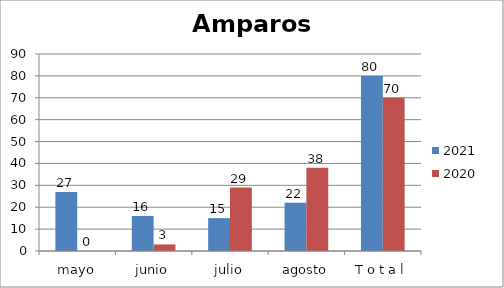
| Category | 2021 | 2020 |
|---|---|---|
| mayo | 27 | 0 |
| junio | 16 | 3 |
| julio | 15 | 29 |
| agosto | 22 | 38 |
| T o t a l | 80 | 70 |